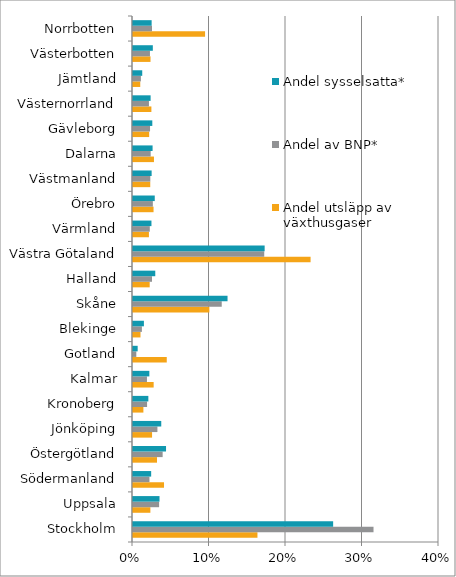
| Category | Andel utsläpp av växthusgaser | Andel av BNP* | Andel sysselsatta* |
|---|---|---|---|
| Stockholm | 0.163 | 0.314 | 0.262 |
| Uppsala | 0.023 | 0.034 | 0.035 |
| Södermanland | 0.041 | 0.022 | 0.024 |
| Östergötland | 0.031 | 0.039 | 0.043 |
| Jönköping | 0.025 | 0.032 | 0.037 |
| Kronoberg | 0.014 | 0.018 | 0.02 |
| Kalmar | 0.027 | 0.018 | 0.021 |
| Gotland | 0.044 | 0.004 | 0.006 |
| Blekinge | 0.01 | 0.012 | 0.014 |
| Skåne | 0.1 | 0.116 | 0.124 |
| Halland | 0.022 | 0.025 | 0.029 |
| Västra Götaland | 0.232 | 0.172 | 0.172 |
| Värmland | 0.021 | 0.022 | 0.024 |
| Örebro | 0.027 | 0.026 | 0.028 |
| Västmanland | 0.023 | 0.023 | 0.024 |
| Dalarna | 0.027 | 0.023 | 0.026 |
| Gävleborg | 0.021 | 0.022 | 0.025 |
| Västernorrland | 0.024 | 0.021 | 0.023 |
| Jämtland | 0.009 | 0.01 | 0.012 |
| Västerbotten | 0.023 | 0.022 | 0.026 |
| Norrbotten | 0.094 | 0.025 | 0.024 |